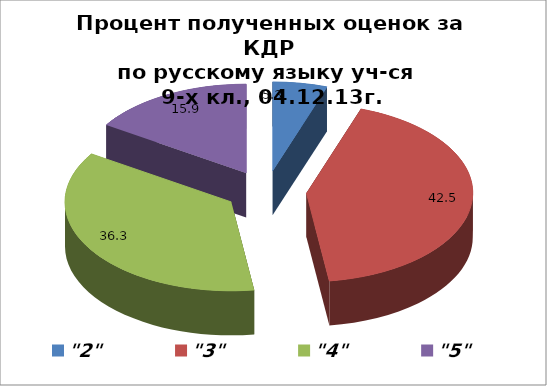
| Category | Series 0 |
|---|---|
| "2" | 5.3 |
| "3" | 42.5 |
| "4" | 36.3 |
| "5" | 15.9 |